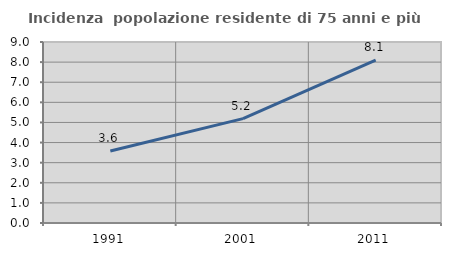
| Category | Incidenza  popolazione residente di 75 anni e più |
|---|---|
| 1991.0 | 3.579 |
| 2001.0 | 5.191 |
| 2011.0 | 8.102 |